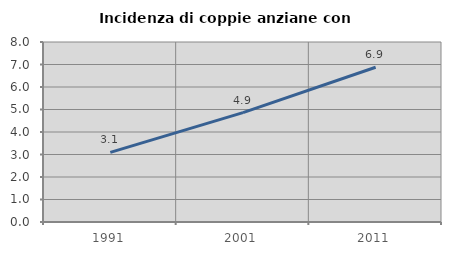
| Category | Incidenza di coppie anziane con figli |
|---|---|
| 1991.0 | 3.097 |
| 2001.0 | 4.862 |
| 2011.0 | 6.879 |